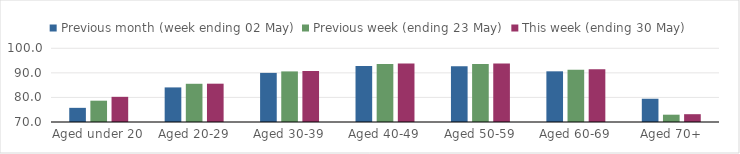
| Category | Previous month (week ending 02 May) | Previous week (ending 23 May) | This week (ending 30 May) |
|---|---|---|---|
| Aged under 20 | 75.76 | 78.671 | 80.244 |
| Aged 20-29 | 84.076 | 85.552 | 85.594 |
| Aged 30-39 | 89.991 | 90.59 | 90.793 |
| Aged 40-49 | 92.806 | 93.61 | 93.842 |
| Aged 50-59 | 92.721 | 93.628 | 93.844 |
| Aged 60-69 | 90.625 | 91.298 | 91.436 |
| Aged 70+ | 79.461 | 72.972 | 73.18 |